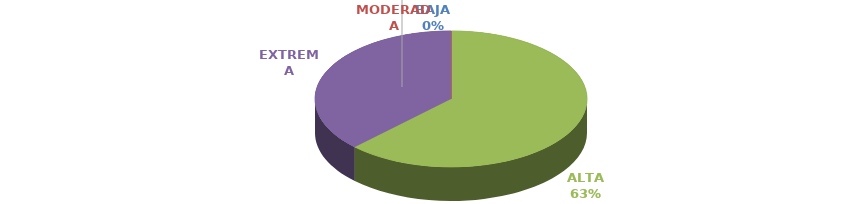
| Category | Series 0 |
|---|---|
| BAJA | 0 |
| MODERADA | 0 |
| ALTA | 15 |
| EXTREMA | 9 |